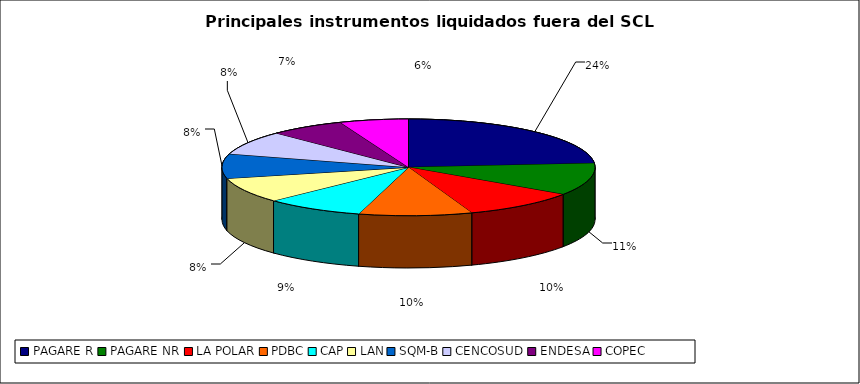
| Category | Series 0 |
|---|---|
| PAGARE R | 2340 |
| PAGARE NR | 1066 |
| LA POLAR | 993 |
| PDBC | 970 |
| CAP | 847 |
| LAN | 836 |
| SQM-B | 809 |
| CENCOSUD | 790 |
| ENDESA | 645 |
| COPEC | 590 |